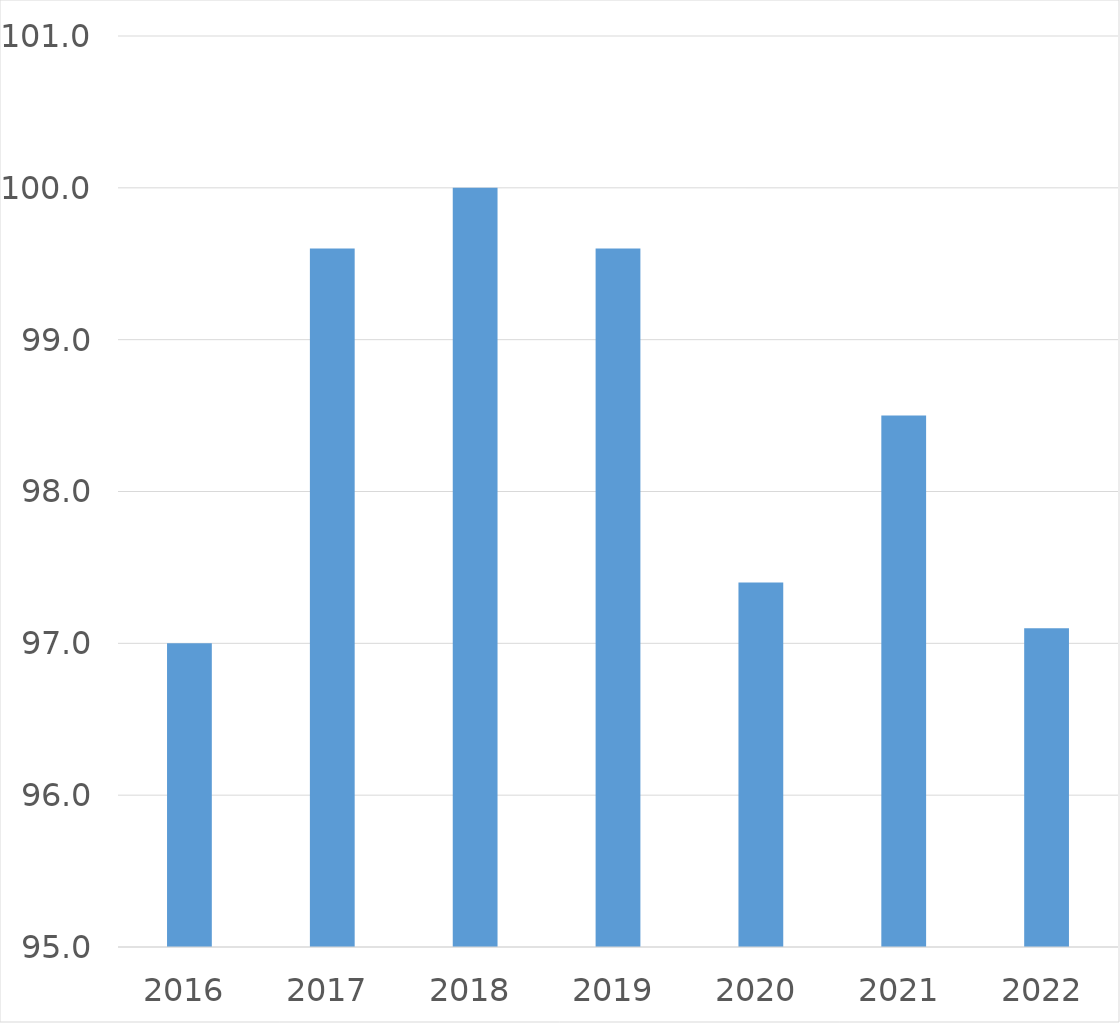
| Category | Series 0 |
|---|---|
| 2016 | 97 |
| 2017 | 99.6 |
| 2018 | 100 |
| 2019 | 99.6 |
| 2020 | 97.4 |
| 2021 | 98.5 |
| 2022 | 97.1 |